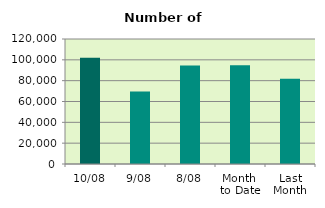
| Category | Series 0 |
|---|---|
| 10/08 | 102000 |
| 9/08 | 69542 |
| 8/08 | 94494 |
| Month 
to Date | 94706.25 |
| Last
Month | 81818 |